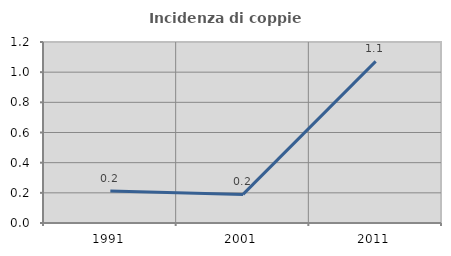
| Category | Incidenza di coppie miste |
|---|---|
| 1991.0 | 0.212 |
| 2001.0 | 0.189 |
| 2011.0 | 1.071 |